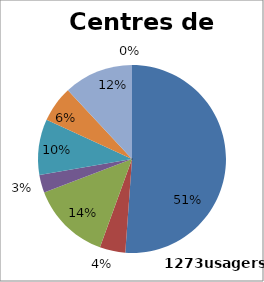
| Category | Series 0 |
|---|---|
| 0 | 51.139 |
| 1 | 4.399 |
| 2 | 13.668 |
| 3 | 3.064 |
| 4 | 9.584 |
| 5 | 6.206 |
| 6 | 11.94 |
| 7 | 0 |